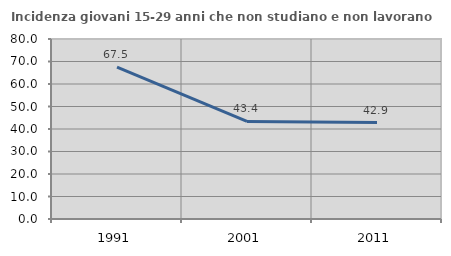
| Category | Incidenza giovani 15-29 anni che non studiano e non lavorano  |
|---|---|
| 1991.0 | 67.55 |
| 2001.0 | 43.363 |
| 2011.0 | 42.857 |